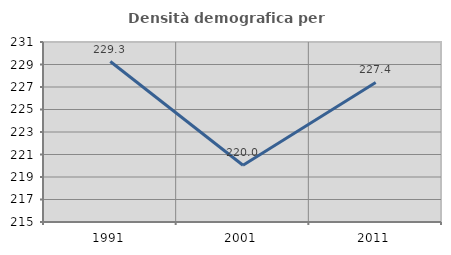
| Category | Densità demografica |
|---|---|
| 1991.0 | 229.265 |
| 2001.0 | 220.048 |
| 2011.0 | 227.404 |